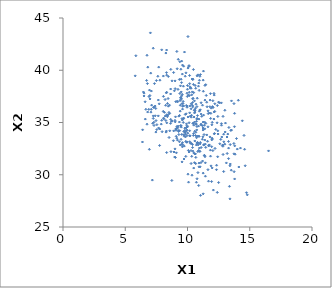
| Category | Series 0 |
|---|---|
| 10.901508904489038 | 28.969 |
| 12.145793151521302 | 33.913 |
| 11.434217759694812 | 31.139 |
| 6.3850084298747385 | 33.134 |
| 7.176947140655388 | 29.488 |
| 9.670634223605564 | 38.477 |
| 12.67272344650577 | 33.384 |
| 11.431428630816619 | 32.935 |
| 11.359011072844716 | 34.733 |
| 12.431922739038928 | 34.198 |
| 13.30245713891043 | 32.548 |
| 12.49990422843831 | 29.254 |
| 10.024515015585322 | 33.979 |
| 10.534838308191535 | 36.18 |
| 8.335005881317102 | 34.965 |
| 10.950177970211582 | 32.241 |
| 8.950135794437525 | 38.032 |
| 10.716010670757683 | 29.283 |
| 10.337895083893567 | 31.765 |
| 10.469657858611765 | 33.764 |
| 9.160861556855565 | 34.439 |
| 14.001390604199727 | 32.457 |
| 9.841585631346371 | 33.875 |
| 10.767236352649599 | 39.464 |
| 9.557153013341917 | 36.797 |
| 8.262514506521379 | 41.644 |
| 9.530721415074478 | 37.55 |
| 11.985085949182801 | 35.014 |
| 8.386538769498333 | 35.556 |
| 13.727993258587452 | 32.99 |
| 7.7288172711548375 | 36.787 |
| 9.582219380270601 | 35.241 |
| 7.501411799820003 | 39.013 |
| 10.405772387626921 | 32.607 |
| 10.702421377722702 | 34.859 |
| 9.486219812256211 | 39.141 |
| 10.927903425832618 | 33.673 |
| 7.657392144321399 | 37.149 |
| 10.158117412115041 | 37.569 |
| 8.278136938498305 | 34.081 |
| 9.140519007093548 | 33.498 |
| 9.878188795802865 | 39.753 |
| 7.685997733271941 | 40.298 |
| 9.58929667649101 | 39.634 |
| 9.997544990388269 | 38.538 |
| 9.302802456481055 | 35.608 |
| 8.337411967508297 | 35.746 |
| 9.58842538705304 | 32.668 |
| 8.638121267422559 | 34.915 |
| 6.780096631151501 | 38.722 |
| 10.759841254111981 | 35.318 |
| 13.04909330932606 | 34.946 |
| 10.430450931656265 | 34.92 |
| 10.592241658111789 | 31.986 |
| 7.202981239946433 | 34.924 |
| 9.474795955545176 | 37.211 |
| 10.880022981606846 | 38.477 |
| 9.36735035010613 | 34.219 |
| 13.517892055735196 | 30.438 |
| 7.400686818340837 | 36.574 |
| 7.540141251815639 | 34.794 |
| 9.28386578077642 | 34.14 |
| 12.146579853978869 | 37.625 |
| 12.856487880963778 | 31.939 |
| 14.805061859835902 | 28.078 |
| 6.977765316804238 | 37.583 |
| 9.144039339888758 | 41.799 |
| 9.43545405017744 | 38.508 |
| 10.781045526555308 | 33.697 |
| 11.025944210086351 | 36.216 |
| 10.17481584394538 | 33.159 |
| 7.0637983566325095 | 35.988 |
| 9.423769013483273 | 32.845 |
| 13.52972587254579 | 34.278 |
| 10.599055201818203 | 35.998 |
| 10.287833848434545 | 31.073 |
| 11.698270179102138 | 32.762 |
| 8.065147914290641 | 37.501 |
| 9.791400643108373 | 34.25 |
| 11.940644289014468 | 32.685 |
| 10.174070809007866 | 35.923 |
| 9.243505840707828 | 34.647 |
| 8.4579683598367 | 39.403 |
| 6.613007561565963 | 35.326 |
| 10.505602296581724 | 32.081 |
| 9.17102416380509 | 40.143 |
| 7.68065282871185 | 34.476 |
| 11.815783425583401 | 37.144 |
| 11.690014131161949 | 29.383 |
| 10.284784105349905 | 32.312 |
| 9.504872342916473 | 37.324 |
| 10.12319252151768 | 40.442 |
| 13.41115753637884 | 30.859 |
| 10.766059488805887 | 35.39 |
| 11.09435418779791 | 36.888 |
| 10.489813774974284 | 33.94 |
| 9.038385921629217 | 35.542 |
| 10.057960638073341 | 37.619 |
| 12.037608546288284 | 37.085 |
| 10.68546316936145 | 36.75 |
| 9.862712745009567 | 33.193 |
| 11.74849545032959 | 35.9 |
| 11.973158299153939 | 33.502 |
| 9.482731030305906 | 33.387 |
| 10.582565035657046 | 34.163 |
| 12.753941333201475 | 33.612 |
| 11.646291652010841 | 34.588 |
| 9.221067532548469 | 34.533 |
| 10.403130931201911 | 32.89 |
| 8.314413986481124 | 39.773 |
| 13.483017039681899 | 34.238 |
| 7.927616102532062 | 41.954 |
| 10.93501475231696 | 38.073 |
| 10.800876802568638 | 33.103 |
| 11.242992091893479 | 34.475 |
| 10.757515647796849 | 36.517 |
| 8.740009248895127 | 29.454 |
| 10.667737151092798 | 34.066 |
| 8.709450643105445 | 35.119 |
| 16.510412606121044 | 32.283 |
| 12.125542350711747 | 37.784 |
| 10.239484848171372 | 33.006 |
| 10.498908576238957 | 30.64 |
| 14.405109235814388 | 35.16 |
| 8.884952724378241 | 39.783 |
| 11.40486794008665 | 37.142 |
| 11.36746240804433 | 31.825 |
| 7.087502055642476 | 36.262 |
| 11.719943744192626 | 32.798 |
| 9.26085686057328 | 34.235 |
| 7.447401751839612 | 36.343 |
| 7.098135995285386 | 38.009 |
| 11.875196029826075 | 35.878 |
| 10.635208878791532 | 36.366 |
| 12.39333669019273 | 28.311 |
| 14.122928141286252 | 30.742 |
| 8.062155630814003 | 39.442 |
| 13.936347834507977 | 33.467 |
| 12.792216478282667 | 32.801 |
| 11.83990741202145 | 32.355 |
| 10.987814395505755 | 36.189 |
| 11.85922116879507 | 35.392 |
| 9.106875043428127 | 32.097 |
| 8.298086617915857 | 37.833 |
| 9.959576903626388 | 37.799 |
| 11.844630442048828 | 37.761 |
| 10.918503316136333 | 35.325 |
| 10.123240105088476 | 32.174 |
| 9.917197313931963 | 34.873 |
| 9.659192455422257 | 35.004 |
| 13.17480043555783 | 33.611 |
| 10.085576844041364 | 29.289 |
| 10.441489755984628 | 32.258 |
| 6.596757777359737 | 36.982 |
| 7.250481067802625 | 35.39 |
| 10.287066685776603 | 36.311 |
| 10.764589194116914 | 29.616 |
| 9.531420791752463 | 40.875 |
| 10.837760020144247 | 30.205 |
| 14.253775063280797 | 32.553 |
| 13.327371176715873 | 34.524 |
| 8.646600501163878 | 38.202 |
| 8.244759357487023 | 36.646 |
| 6.990225553392001 | 37.254 |
| 6.4596623351877085 | 37.919 |
| 10.434138229473064 | 39.155 |
| 8.518992642385552 | 33.566 |
| 9.471487416148188 | 40.099 |
| 12.39700822159272 | 36.622 |
| 7.3021585925399926 | 35.02 |
| 9.07743689044538 | 34.253 |
| 10.80378095209198 | 35.663 |
| 11.087510853354987 | 34.775 |
| 9.384272526463779 | 37.778 |
| 8.671618094233228 | 32.21 |
| 11.57196395430518 | 36.507 |
| 6.888957443921994 | 36.256 |
| 11.0397211363302 | 39.586 |
| 9.482477593726948 | 37.33 |
| 9.305103999228793 | 33.848 |
| 11.259157082154854 | 30.156 |
| 9.819388887978588 | 35.774 |
| 10.040196924884182 | 35.531 |
| 8.106667087345063 | 35.352 |
| 12.32889731012115 | 30.483 |
| 11.439281717211673 | 29.863 |
| 10.959765360950982 | 39.039 |
| 11.047951677308435 | 28.025 |
| 12.054092221917388 | 36.44 |
| 8.460562714002908 | 36.562 |
| 10.554523107782309 | 37.067 |
| 9.68997423639274 | 40.39 |
| 14.738868778675341 | 28.283 |
| 11.195374190602877 | 33.4 |
| 10.720048413913691 | 32.845 |
| 11.292231254540592 | 35.708 |
| 9.91243924786813 | 34.514 |
| 8.565076961510162 | 35.855 |
| 7.9596000394956405 | 34.122 |
| 10.038774315270807 | 30.054 |
| 8.643018118934027 | 37.73 |
| 7.3118413197432295 | 34.717 |
| 10.757788008416703 | 34.617 |
| 10.47614307778365 | 40.071 |
| 9.00874814206715 | 38.239 |
| 9.42203492020685 | 36.649 |
| 7.785261589636551 | 39.049 |
| 11.64760349503863 | 36.115 |
| 11.235919641291783 | 33.627 |
| 13.780201632148545 | 35.878 |
| 11.314606942761591 | 32.883 |
| 6.7487834449104165 | 34.837 |
| 7.247901120876018 | 42.107 |
| 9.352319535144002 | 35.044 |
| 6.7481123392906355 | 41.433 |
| 14.636256209052942 | 30.86 |
| 11.890475117370967 | 30.851 |
| 11.543722686168579 | 36.941 |
| 9.205787503492274 | 36.977 |
| 8.663055514706627 | 40.084 |
| 12.078366099589806 | 28.532 |
| 10.613071619024153 | 38.542 |
| 9.563588646482037 | 31.23 |
| 5.855564689752805 | 41.39 |
| 7.286230322581936 | 36.475 |
| 10.00801454645087 | 34.593 |
| 9.523025272639368 | 38.816 |
| 8.326083778797148 | 39.531 |
| 10.865093276928016 | 33.021 |
| 14.58334195135855 | 32.437 |
| 9.836789652646676 | 33.623 |
| 10.92452526893328 | 30.758 |
| 10.58728262685263 | 33.233 |
| 11.753294873372317 | 32.856 |
| 13.822211368057523 | 31.965 |
| 11.082942467760214 | 31.164 |
| 13.299929526916735 | 31.543 |
| 10.642885913541827 | 33.755 |
| 13.002569015025092 | 36.17 |
| 10.656661877945325 | 31.068 |
| 11.471032095829598 | 34.921 |
| 9.539588874769649 | 33.856 |
| 8.972785850402822 | 31.696 |
| 8.328235273931808 | 32.123 |
| 11.197614647932658 | 34.686 |
| 10.386635488577575 | 37.928 |
| 10.63775534563611 | 31.998 |
| 11.097544535752494 | 32.607 |
| 9.611189826247672 | 36.548 |
| 10.955044711648936 | 36.083 |
| 11.95021119345311 | 33.337 |
| 12.496887105583296 | 36.951 |
| 9.05579286813929 | 34.368 |
| 9.902862769611952 | 36.625 |
| 11.352149485547445 | 31.864 |
| 6.514392005777074 | 37.814 |
| 13.79016195209475 | 32.766 |
| 8.994991216806092 | 32.475 |
| 10.659072121807144 | 38.276 |
| 10.363919250239887 | 29.957 |
| 10.719647010575098 | 35.109 |
| 9.958607530134747 | 34.272 |
| 10.564028088113858 | 35.914 |
| 9.810879092524422 | 34.075 |
| 11.03080145382052 | 33.092 |
| 13.73280066070233 | 32.005 |
| 10.5069253107138 | 34.746 |
| 8.075385959360458 | 35.414 |
| 10.480051405897097 | 34.921 |
| 9.648715175479618 | 37.016 |
| 11.849304426557547 | 31.777 |
| 7.470832213547499 | 35.18 |
| 13.78473994878556 | 29.599 |
| 9.811804653882975 | 34.01 |
| 9.699313126803673 | 35.417 |
| 6.948805612046866 | 38.1 |
| 9.63428300220742 | 36.811 |
| 11.20559689534565 | 36.656 |
| 13.410265227825551 | 27.694 |
| 7.534263190656181 | 34.324 |
| 7.118690253813782 | 36.662 |
| 13.001748556038216 | 32.925 |
| 12.458326780991927 | 33.899 |
| 9.788368293875784 | 34.462 |
| 9.412749170253349 | 36.087 |
| 9.741013837228675 | 32.742 |
| 10.070541739240031 | 32.327 |
| 9.081109105474882 | 34.395 |
| 10.3250817508968 | 35.688 |
| 11.209235393469312 | 31.313 |
| 9.74451381321066 | 33.692 |
| 8.307325827898584 | 34.18 |
| 10.408837427701771 | 36.913 |
| 10.741494923800726 | 34.289 |
| 11.016451477395135 | 32.955 |
| 10.31957089247132 | 33.003 |
| 10.18694063783667 | 33.745 |
| 11.661933844307226 | 35.852 |
| 13.026027245901115 | 34.092 |
| 8.415433559911108 | 35.721 |
| 14.540679244008448 | 33.76 |
| 11.307217243986052 | 32.836 |
| 8.052194452983723 | 36.067 |
| 8.510274771148165 | 35.964 |
| 13.533839693596983 | 37.066 |
| 8.331540251457145 | 37.894 |
| 10.14164308477132 | 37.889 |
| 11.957218576356379 | 34.778 |
| 9.9468283711205 | 33.103 |
| 10.889698899230012 | 34.656 |
| 11.801007520833364 | 33.621 |
| 12.594046105817966 | 32.965 |
| 10.126743916783797 | 34.977 |
| 8.197069172375821 | 37.199 |
| 12.187505339431999 | 36.057 |
| 8.992344018110433 | 35.204 |
| 8.320143588896476 | 41.935 |
| 10.171676683577301 | 38.716 |
| 10.186770295608104 | 33.706 |
| 9.601133638351858 | 40.496 |
| 10.415473096748926 | 36.497 |
| 11.462065657506729 | 38.619 |
| 8.150741893377319 | 35.973 |
| 10.898236953715209 | 32.329 |
| 9.509290323513083 | 32.909 |
| 10.614941671921134 | 36.177 |
| 11.404234044642982 | 38.545 |
| 12.719700401280445 | 36.878 |
| 7.285839815127735 | 36.436 |
| 11.085063219659848 | 34.84 |
| 10.420444515491038 | 39.108 |
| 9.451164596540828 | 34.698 |
| 10.691134311165733 | 34.825 |
| 11.281305292346989 | 39.919 |
| 9.817860771098951 | 39.429 |
| 12.917077384150415 | 33.152 |
| 11.505176356885155 | 37.589 |
| 13.74311676439604 | 30.295 |
| 9.16480012744084 | 37.032 |
| 11.142990036418995 | 35.593 |
| 8.75891643023614 | 38.986 |
| 7.931697301682359 | 35.211 |
| 12.90507346547498 | 33.882 |
| 9.363373661261509 | 35.679 |
| 11.389643728686986 | 35.021 |
| 9.88957248767213 | 35.831 |
| 7.893140662009216 | 34.845 |
| 10.784549784290832 | 37.324 |
| 9.012593947857942 | 35.059 |
| 9.090571545643712 | 33.676 |
| 12.845217828976224 | 32.729 |
| 9.503604739537844 | 34.559 |
| 10.403780884376314 | 36.633 |
| 9.688152520887261 | 33.829 |
| 12.174748418142409 | 33.941 |
| 9.19644919376127 | 33.317 |
| 12.858843251499835 | 32.856 |
| 9.919719161240915 | 34.52 |
| 11.095759988303557 | 35.809 |
| 8.889376668317194 | 34.198 |
| 10.30487465654683 | 35.511 |
| 10.2255862899157 | 35.61 |
| 11.388667678621928 | 33.322 |
| 11.260766145048459 | 28.176 |
| 6.90995429701458 | 37.48 |
| 9.720897439355108 | 31.508 |
| 12.12284906023316 | 35.328 |
| 10.476853408777474 | 38.646 |
| 10.749617359447516 | 33.038 |
| 8.258221146429593 | 35.188 |
| 11.797815070770316 | 36.512 |
| 9.97631470742366 | 36.572 |
| 13.187854114116188 | 32.035 |
| 9.95374659321189 | 33.144 |
| 7.254187803638965 | 35.63 |
| 9.029121840182968 | 31.652 |
| 10.557751961827565 | 31.157 |
| 9.986731321160002 | 37.489 |
| 9.34833501933335 | 39.121 |
| 7.347238404772158 | 38.722 |
| 11.610658069971723 | 33.202 |
| 7.657810330991253 | 35.631 |
| 13.237909027799828 | 33.892 |
| 13.124699710343412 | 31.132 |
| 11.003119012171174 | 32.241 |
| 12.724329018426795 | 34.891 |
| 9.562722817265396 | 35.377 |
| 12.194039986378002 | 36.792 |
| 9.599665870837873 | 33.076 |
| 11.54907090686281 | 33.809 |
| 9.40066212042013 | 37.093 |
| 9.898252725513313 | 34.181 |
| 9.951844124570805 | 34.695 |
| 11.910382182209103 | 36.375 |
| 10.527838672315612 | 35.524 |
| 11.252397708742361 | 34.278 |
| 8.550067679141355 | 36.664 |
| 12.561874081388245 | 36.88 |
| 10.192482736899848 | 36.585 |
| 13.36979218345342 | 28.891 |
| 10.668961117779242 | 31.66 |
| 12.272664991057322 | 34.341 |
| 12.437027535554709 | 35.579 |
| 5.801767186191213 | 39.465 |
| 9.15094810769205 | 34.619 |
| 8.653240116542115 | 35.296 |
| 9.385970609066021 | 40.816 |
| 10.039553268135728 | 40.208 |
| 9.349299930827097 | 33.163 |
| 7.756100138829345 | 32.802 |
| 12.005332367797408 | 36.524 |
| 10.862709403758727 | 32.862 |
| 7.046855353942513 | 39.724 |
| 10.450748894594124 | 37.314 |
| 12.376494544800476 | 34.97 |
| 11.935663627060457 | 29.348 |
| 11.4045035143582 | 31.725 |
| 12.854153126240027 | 35.586 |
| 8.372426471476608 | 35.683 |
| 9.663078768109562 | 35.348 |
| 10.290687165135534 | 38.282 |
| 6.798750281698492 | 35.999 |
| 9.95345874891362 | 33.741 |
| 8.869554358584182 | 33.259 |
| 10.95635804810252 | 32.555 |
| 12.037064993268636 | 32.31 |
| 8.438041015042256 | 37.293 |
| 10.345797287334461 | 37.653 |
| 10.93400278303067 | 31.119 |
| 9.236504935737987 | 38.17 |
| 9.58028693415238 | 37.687 |
| 10.845009299209238 | 39.558 |
| 12.335285639146026 | 30.909 |
| 10.899335771815506 | 33.694 |
| 12.730902318526535 | 34.738 |
| 6.655514323359787 | 36.26 |
| 9.627058964595717 | 32.869 |
| 8.57489062895294 | 34.205 |
| 13.430152345876525 | 32.889 |
| 12.906088077241485 | 30.307 |
| 10.297624712056242 | 36.788 |
| 10.18478766106596 | 38.42 |
| 9.474835191929186 | 34.701 |
| 9.004362170428116 | 38.981 |
| 6.507231809298069 | 37.54 |
| 7.76927716225666 | 34.375 |
| 10.904491345861903 | 38.773 |
| 11.4628635831485 | 32.62 |
| 11.390550012308005 | 34.394 |
| 13.77210954065617 | 34.597 |
| 10.038150225064978 | 43.226 |
| 10.413952685352555 | 37.266 |
| 11.015302340284608 | 30.758 |
| 10.993089027113616 | 39.421 |
| 13.734653354485136 | 36.808 |
| 9.60135158064618 | 36.281 |
| 11.643184131769257 | 30.485 |
| 9.687771508286254 | 36.581 |
| 9.701946605203421 | 34.146 |
| 8.392213728609875 | 36.823 |
| 12.1410741985824 | 36.008 |
| 11.273433816510659 | 37.991 |
| 6.714679944532048 | 39.028 |
| 12.42446231007643 | 31.721 |
| 6.8106013770477025 | 40.296 |
| 9.257652945375833 | 41.048 |
| 11.2531788716921 | 35.038 |
| 7.019546891840695 | 43.575 |
| 11.261165935263525 | 39.056 |
| 6.393823901593757 | 34.298 |
| 10.37254040579797 | 39.162 |
| 13.296047290326271 | 33.188 |
| 8.212400931736143 | 35.619 |
| 13.436944278974892 | 31.03 |
| 10.568107141680448 | 35.043 |
| 10.219022220825403 | 38.283 |
| 9.058825144218263 | 36.989 |
| 7.410825757240476 | 35.642 |
| 10.49516355778438 | 37.857 |
| 9.866935877903591 | 31.755 |
| 8.763283925907867 | 35.131 |
| 6.937408192975906 | 32.433 |
| 10.114274871706229 | 40.367 |
| 9.962619192733907 | 36.461 |
| 7.618993276104076 | 39.426 |
| 10.727460797551366 | 33.543 |
| 9.49597241177702 | 37.925 |
| 8.917537428618388 | 32.177 |
| 9.758680104738719 | 41.743 |
| 7.459222328717319 | 34.083 |
| 11.979897003744147 | 30.654 |
| 10.827707953185275 | 32.221 |
| 12.212052353503674 | 32.516 |
| 9.995907218199463 | 38.178 |
| 10.164516339978796 | 39.499 |
| 11.99890428997302 | 33.416 |
| 14.082221470877792 | 37.129 |
| 10.169848198819576 | 34.208 |
| 11.330868737311208 | 33.844 |
| 9.440999612714354 | 37.397 |